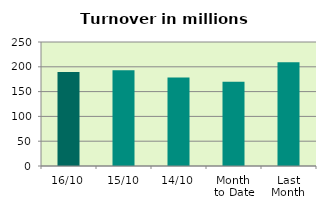
| Category | Series 0 |
|---|---|
| 16/10 | 189.306 |
| 15/10 | 193.161 |
| 14/10 | 178.653 |
| Month 
to Date | 169.673 |
| Last
Month | 209.117 |